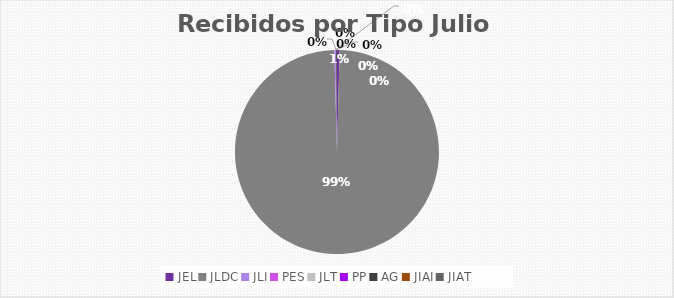
| Category | Series 0 |
|---|---|
| JEL | 3 |
| JLDC | 713 |
| JLI | 2 |
| PES | 0 |
| JLT | 0 |
| PP | 0 |
| AG | 1 |
| JIAI | 0 |
| JIAT | 0 |